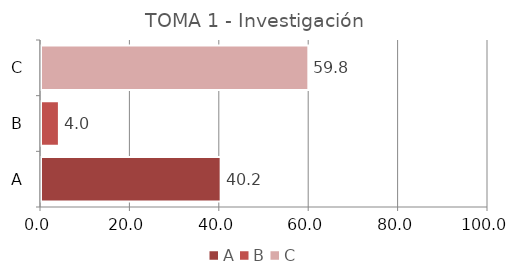
| Category | Series 0 |
|---|---|
| A | 40.192 |
| B | 4.006 |
| C | 59.808 |